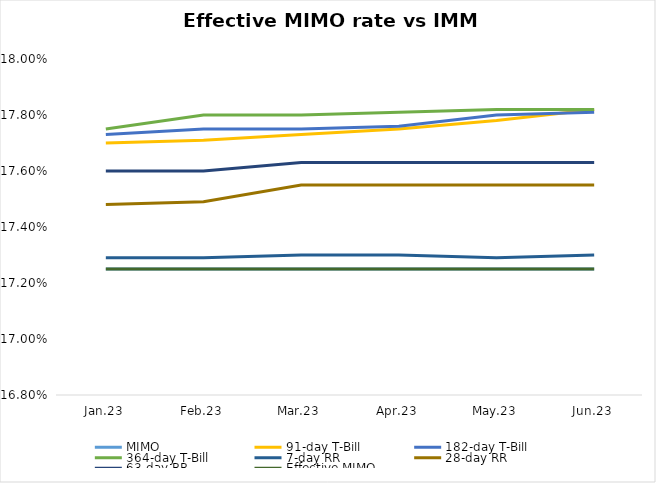
| Category | MIMO | 91-day T-Bill | 182-day T-Bill | 364-day T-Bill | 7-day RR | 28-day RR | 63-day RR | Effective MIMO |
|---|---|---|---|---|---|---|---|---|
| Jan.23 | 0.172 | 0.177 | 0.177 | 0.178 | 0.173 | 0.175 | 0.176 | 0.172 |
| Feb.23 | 0.172 | 0.177 | 0.178 | 0.178 | 0.173 | 0.175 | 0.176 | 0.172 |
| Mar.23 | 0.172 | 0.177 | 0.178 | 0.178 | 0.173 | 0.176 | 0.176 | 0.172 |
| Apr.23 | 0.172 | 0.178 | 0.178 | 0.178 | 0.173 | 0.176 | 0.176 | 0.172 |
| May.23 | 0.172 | 0.178 | 0.178 | 0.178 | 0.173 | 0.176 | 0.176 | 0.172 |
| Jun.23 | 0.172 | 0.178 | 0.178 | 0.178 | 0.173 | 0.176 | 0.176 | 0.172 |